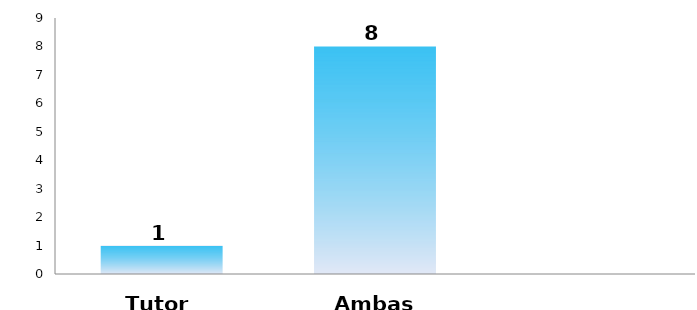
| Category | Series 0 |
|---|---|
| Tutor | 1 |
| Ambas | 8 |